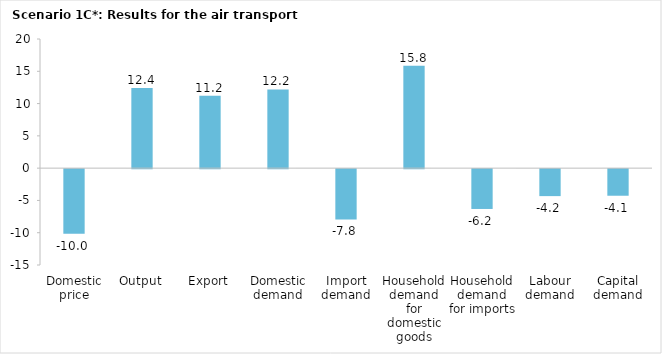
| Category | Series 0 |
|---|---|
| Domestic price | -10 |
| Output | 12.398 |
| Export | 11.228 |
| Domestic demand | 12.187 |
| Import demand | -7.794 |
| Household demand for domestic goods | 15.843 |
| Household demand for imports | -6.167 |
| Labour demand | -4.177 |
| Capital demand | -4.117 |